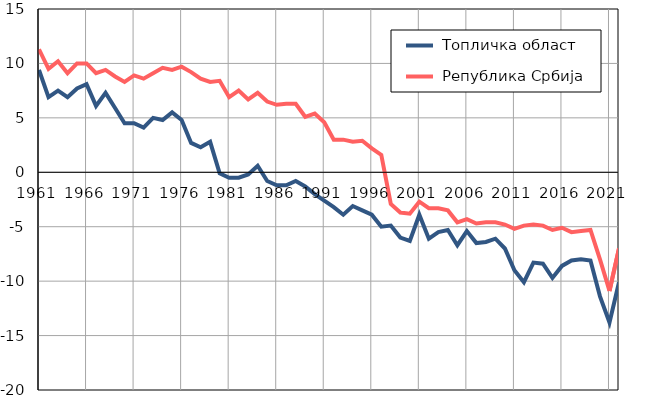
| Category |  Топличка област |  Република Србија |
|---|---|---|
| 1961.0 | 9.4 | 11.3 |
| 1962.0 | 6.9 | 9.5 |
| 1963.0 | 7.5 | 10.2 |
| 1964.0 | 6.9 | 9.1 |
| 1965.0 | 7.7 | 10 |
| 1966.0 | 8.1 | 10 |
| 1967.0 | 6.1 | 9.1 |
| 1968.0 | 7.3 | 9.4 |
| 1969.0 | 5.9 | 8.8 |
| 1970.0 | 4.5 | 8.3 |
| 1971.0 | 4.5 | 8.9 |
| 1972.0 | 4.1 | 8.6 |
| 1973.0 | 5 | 9.1 |
| 1974.0 | 4.8 | 9.6 |
| 1975.0 | 5.5 | 9.4 |
| 1976.0 | 4.8 | 9.7 |
| 1977.0 | 2.7 | 9.2 |
| 1978.0 | 2.3 | 8.6 |
| 1979.0 | 2.8 | 8.3 |
| 1980.0 | -0.1 | 8.4 |
| 1981.0 | -0.5 | 6.9 |
| 1982.0 | -0.5 | 7.5 |
| 1983.0 | -0.2 | 6.7 |
| 1984.0 | 0.6 | 7.3 |
| 1985.0 | -0.8 | 6.5 |
| 1986.0 | -1.2 | 6.2 |
| 1987.0 | -1.2 | 6.3 |
| 1988.0 | -0.8 | 6.3 |
| 1989.0 | -1.3 | 5.1 |
| 1990.0 | -2 | 5.4 |
| 1991.0 | -2.6 | 4.6 |
| 1992.0 | -3.2 | 3 |
| 1993.0 | -3.9 | 3 |
| 1994.0 | -3.1 | 2.8 |
| 1995.0 | -3.5 | 2.9 |
| 1996.0 | -3.9 | 2.2 |
| 1997.0 | -5 | 1.6 |
| 1998.0 | -4.9 | -2.9 |
| 1999.0 | -6 | -3.7 |
| 2000.0 | -6.3 | -3.8 |
| 2001.0 | -3.9 | -2.7 |
| 2002.0 | -6.1 | -3.3 |
| 2003.0 | -5.5 | -3.3 |
| 2004.0 | -5.3 | -3.5 |
| 2005.0 | -6.7 | -4.6 |
| 2006.0 | -5.4 | -4.3 |
| 2007.0 | -6.5 | -4.7 |
| 2008.0 | -6.4 | -4.6 |
| 2009.0 | -6.1 | -4.6 |
| 2010.0 | -7 | -4.8 |
| 2011.0 | -9 | -5.2 |
| 2012.0 | -10.1 | -4.9 |
| 2013.0 | -8.3 | -4.8 |
| 2014.0 | -8.4 | -4.9 |
| 2015.0 | -9.7 | -5.3 |
| 2016.0 | -8.6 | -5.1 |
| 2017.0 | -8.1 | -5.5 |
| 2018.0 | -8 | -5.4 |
| 2019.0 | -8.1 | -5.3 |
| 2020.0 | -11.4 | -8 |
| 2021.0 | -13.8 | -10.9 |
| 2022.0 | -10.1 | -7 |